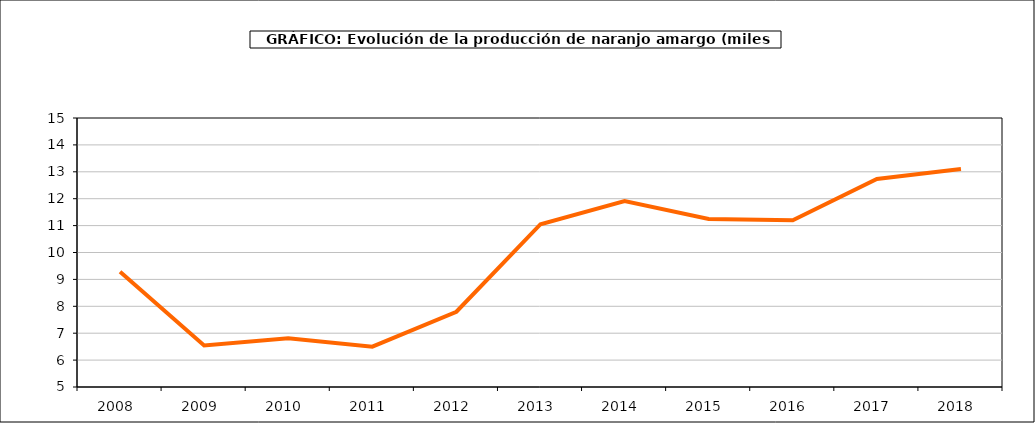
| Category | producción |
|---|---|
| 2008.0 | 9.287 |
| 2009.0 | 6.545 |
| 2010.0 | 6.81 |
| 2011.0 | 6.501 |
| 2012.0 | 7.798 |
| 2013.0 | 11.051 |
| 2014.0 | 11.915 |
| 2015.0 | 11.247 |
| 2016.0 | 11.197 |
| 2017.0 | 12.735 |
| 2018.0 | 13.1 |